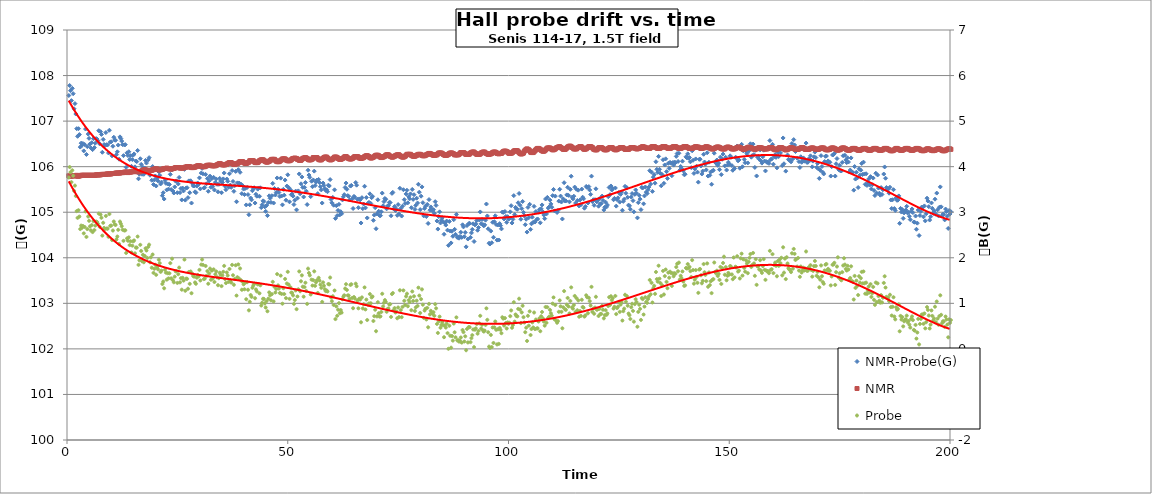
| Category | NMR-Probe(G) |
|---|---|
| 0.4 | 107.562 |
| 0.6000000000000001 | 107.782 |
| 0.8 | 107.668 |
| 1.0 | 107.45 |
| 1.2 | 107.72 |
| 1.4 | 107.602 |
| 1.5999999999999999 | 107.27 |
| 1.7999999999999998 | 107.384 |
| 1.9999999999999998 | 107.156 |
| 2.1999999999999997 | 106.834 |
| 2.4 | 106.666 |
| 2.6 | 106.834 |
| 2.8000000000000003 | 106.704 |
| 3.0000000000000004 | 106.43 |
| 3.2000000000000006 | 106.516 |
| 3.400000000000001 | 106.47 |
| 3.600000000000001 | 106.508 |
| 3.800000000000001 | 106.346 |
| 4.000000000000001 | 106.486 |
| 4.200000000000001 | 106.826 |
| 4.400000000000001 | 106.268 |
| 4.600000000000001 | 106.44 |
| 4.800000000000002 | 106.716 |
| 5.000000000000002 | 106.622 |
| 5.200000000000002 | 106.498 |
| 5.400000000000002 | 106.412 |
| 5.600000000000002 | 106.526 |
| 5.8000000000000025 | 106.374 |
| 6.000000000000003 | 106.614 |
| 6.200000000000003 | 106.418 |
| 6.400000000000003 | 106.516 |
| 6.600000000000003 | 106.616 |
| 6.800000000000003 | 106.606 |
| 7.0000000000000036 | 106.568 |
| 7.200000000000004 | 106.79 |
| 7.400000000000004 | 106.5 |
| 7.600000000000004 | 106.768 |
| 7.800000000000004 | 106.708 |
| 8.000000000000004 | 106.316 |
| 8.200000000000003 | 106.598 |
| 8.400000000000002 | 106.486 |
| 8.600000000000001 | 106.464 |
| 8.8 | 106.748 |
| 9.0 | 106.482 |
| 9.2 | 106.478 |
| 9.399999999999999 | 106.3 |
| 9.599999999999998 | 106.8 |
| 9.799999999999997 | 106.54 |
| 9.999999999999996 | 106.546 |
| 10.199999999999996 | 106.238 |
| 10.399999999999995 | 106.448 |
| 10.599999999999994 | 106.646 |
| 10.799999999999994 | 106.584 |
| 10.999999999999993 | 106.58 |
| 11.199999999999992 | 106.262 |
| 11.399999999999991 | 106.326 |
| 11.59999999999999 | 106.474 |
| 11.79999999999999 | 106.164 |
| 11.99999999999999 | 106.654 |
| 12.199999999999989 | 106.618 |
| 12.399999999999988 | 106.562 |
| 12.599999999999987 | 106.484 |
| 12.799999999999986 | 106.242 |
| 12.999999999999986 | 106.478 |
| 13.199999999999985 | 106.484 |
| 13.399999999999984 | 105.986 |
| 13.599999999999984 | 106.304 |
| 13.799999999999983 | 106.244 |
| 13.999999999999982 | 106.328 |
| 14.199999999999982 | 106.158 |
| 14.39999999999998 | 106.242 |
| 14.59999999999998 | 106.008 |
| 14.79999999999998 | 106.156 |
| 14.999999999999979 | 106.252 |
| 15.199999999999978 | 106.28 |
| 15.399999999999977 | 105.996 |
| 15.599999999999977 | 106.124 |
| 15.799999999999976 | 106.112 |
| 15.999999999999975 | 106.356 |
| 16.199999999999974 | 105.734 |
| 16.399999999999974 | 105.834 |
| 16.599999999999973 | 106.174 |
| 16.799999999999972 | 106.05 |
| 16.99999999999997 | 105.834 |
| 17.19999999999997 | 105.986 |
| 17.39999999999997 | 105.832 |
| 17.59999999999997 | 105.97 |
| 17.79999999999997 | 106.138 |
| 17.999999999999968 | 106.08 |
| 18.199999999999967 | 105.916 |
| 18.399999999999967 | 106.148 |
| 18.599999999999966 | 106.198 |
| 18.799999999999965 | 105.812 |
| 18.999999999999964 | 105.93 |
| 19.199999999999964 | 105.702 |
| 19.399999999999963 | 106.002 |
| 19.599999999999962 | 105.608 |
| 19.79999999999996 | 105.708 |
| 19.99999999999996 | 105.796 |
| 20.19999999999996 | 105.576 |
| 20.39999999999996 | 105.746 |
| 20.59999999999996 | 105.688 |
| 20.799999999999958 | 105.888 |
| 20.999999999999957 | 105.812 |
| 21.199999999999957 | 105.62 |
| 21.399999999999956 | 105.658 |
| 21.599999999999955 | 105.364 |
| 21.799999999999955 | 105.428 |
| 21.999999999999954 | 105.29 |
| 22.199999999999953 | 105.698 |
| 22.399999999999952 | 105.634 |
| 22.59999999999995 | 105.49 |
| 22.79999999999995 | 105.622 |
| 22.99999999999995 | 105.508 |
| 23.19999999999995 | 105.61 |
| 23.39999999999995 | 105.832 |
| 23.599999999999948 | 105.498 |
| 23.799999999999947 | 105.93 |
| 23.999999999999947 | 105.466 |
| 24.199999999999946 | 105.422 |
| 24.399999999999945 | 105.556 |
| 24.599999999999945 | 105.682 |
| 24.799999999999944 | 105.688 |
| 24.999999999999943 | 105.428 |
| 25.199999999999942 | 105.62 |
| 25.39999999999994 | 105.764 |
| 25.59999999999994 | 105.43 |
| 25.79999999999994 | 105.522 |
| 25.99999999999994 | 105.27 |
| 26.19999999999994 | 105.53 |
| 26.399999999999938 | 105.468 |
| 26.599999999999937 | 105.94 |
| 26.799999999999937 | 105.266 |
| 26.999999999999936 | 105.532 |
| 27.199999999999935 | 105.538 |
| 27.399999999999935 | 105.32 |
| 27.599999999999934 | 105.688 |
| 27.799999999999933 | 105.428 |
| 27.999999999999932 | 105.69 |
| 28.199999999999932 | 105.202 |
| 28.39999999999993 | 105.63 |
| 28.59999999999993 | 105.578 |
| 28.79999999999993 | 105.576 |
| 28.99999999999993 | 105.448 |
| 29.19999999999993 | 105.43 |
| 29.399999999999928 | 105.574 |
| 29.599999999999927 | 105.642 |
| 29.799999999999926 | 105.612 |
| 29.999999999999925 | 105.754 |
| 30.199999999999925 | 105.512 |
| 30.399999999999924 | 105.86 |
| 30.599999999999923 | 105.962 |
| 30.799999999999923 | 105.844 |
| 30.999999999999922 | 105.532 |
| 31.19999999999992 | 105.542 |
| 31.39999999999992 | 105.83 |
| 31.59999999999992 | 105.624 |
| 31.79999999999992 | 105.738 |
| 31.99999999999992 | 105.46 |
| 32.19999999999992 | 105.686 |
| 32.39999999999992 | 105.792 |
| 32.59999999999992 | 105.548 |
| 32.799999999999926 | 105.738 |
| 32.99999999999993 | 105.562 |
| 33.19999999999993 | 105.766 |
| 33.399999999999935 | 105.488 |
| 33.59999999999994 | 105.658 |
| 33.79999999999994 | 105.73 |
| 33.99999999999994 | 105.612 |
| 34.199999999999946 | 105.448 |
| 34.39999999999995 | 105.612 |
| 34.59999999999995 | 105.742 |
| 34.799999999999955 | 105.686 |
| 34.99999999999996 | 105.428 |
| 35.19999999999996 | 105.654 |
| 35.39999999999996 | 105.732 |
| 35.599999999999966 | 105.862 |
| 35.79999999999997 | 105.57 |
| 35.99999999999997 | 105.494 |
| 36.199999999999974 | 105.728 |
| 36.39999999999998 | 105.68 |
| 36.59999999999998 | 105.55 |
| 36.79999999999998 | 105.844 |
| 36.999999999999986 | 105.596 |
| 37.19999999999999 | 105.546 |
| 37.39999999999999 | 105.914 |
| 37.599999999999994 | 105.676 |
| 37.8 | 105.458 |
| 38.0 | 105.584 |
| 38.2 | 105.896 |
| 38.400000000000006 | 105.23 |
| 38.60000000000001 | 105.644 |
| 38.80000000000001 | 105.934 |
| 39.000000000000014 | 105.64 |
| 39.20000000000002 | 105.876 |
| 39.40000000000002 | 105.616 |
| 39.60000000000002 | 105.408 |
| 39.800000000000026 | 105.582 |
| 40.00000000000003 | 105.508 |
| 40.20000000000003 | 105.388 |
| 40.400000000000034 | 105.524 |
| 40.60000000000004 | 105.16 |
| 40.80000000000004 | 105.544 |
| 41.00000000000004 | 105.388 |
| 41.200000000000045 | 104.946 |
| 41.40000000000005 | 105.164 |
| 41.60000000000005 | 105.312 |
| 41.800000000000054 | 105.272 |
| 42.00000000000006 | 105.472 |
| 42.20000000000006 | 105.522 |
| 42.40000000000006 | 105.538 |
| 42.600000000000065 | 105.202 |
| 42.80000000000007 | 105.394 |
| 43.00000000000007 | 105.352 |
| 43.200000000000074 | 105.506 |
| 43.40000000000008 | 105.532 |
| 43.60000000000008 | 105.35 |
| 43.80000000000008 | 105.536 |
| 44.000000000000085 | 105.102 |
| 44.20000000000009 | 105.164 |
| 44.40000000000009 | 105.25 |
| 44.600000000000094 | 105.236 |
| 44.8000000000001 | 105.118 |
| 45.0000000000001 | 105.018 |
| 45.2000000000001 | 105.148 |
| 45.400000000000105 | 104.926 |
| 45.60000000000011 | 105.212 |
| 45.80000000000011 | 105.36 |
| 46.000000000000114 | 105.306 |
| 46.20000000000012 | 105.216 |
| 46.40000000000012 | 105.362 |
| 46.60000000000012 | 105.632 |
| 46.800000000000125 | 105.202 |
| 47.00000000000013 | 105.522 |
| 47.20000000000013 | 105.378 |
| 47.400000000000134 | 105.434 |
| 47.600000000000136 | 105.752 |
| 47.80000000000014 | 105.504 |
| 48.00000000000014 | 105.434 |
| 48.200000000000145 | 105.346 |
| 48.40000000000015 | 105.748 |
| 48.60000000000015 | 105.356 |
| 48.80000000000015 | 105.162 |
| 49.000000000000156 | 105.502 |
| 49.20000000000016 | 105.374 |
| 49.40000000000016 | 105.706 |
| 49.600000000000165 | 105.264 |
| 49.80000000000017 | 105.574 |
| 50.00000000000017 | 105.822 |
| 50.20000000000017 | 105.542 |
| 50.400000000000176 | 105.228 |
| 50.60000000000018 | 105.494 |
| 50.80000000000018 | 105.386 |
| 51.000000000000185 | 105.4 |
| 51.20000000000019 | 105.354 |
| 51.40000000000019 | 105.168 |
| 51.60000000000019 | 105.262 |
| 51.800000000000196 | 105.464 |
| 52.0000000000002 | 105.052 |
| 52.2000000000002 | 105.31 |
| 52.400000000000205 | 105.468 |
| 52.60000000000021 | 105.84 |
| 52.80000000000021 | 105.406 |
| 53.00000000000021 | 105.624 |
| 53.200000000000216 | 105.774 |
| 53.40000000000022 | 105.546 |
| 53.60000000000022 | 105.336 |
| 53.800000000000225 | 105.546 |
| 54.00000000000023 | 105.652 |
| 54.20000000000023 | 105.462 |
| 54.40000000000023 | 105.168 |
| 54.600000000000236 | 105.922 |
| 54.80000000000024 | 105.816 |
| 55.00000000000024 | 105.764 |
| 55.200000000000244 | 105.344 |
| 55.40000000000025 | 105.68 |
| 55.60000000000025 | 105.56 |
| 55.80000000000025 | 105.708 |
| 56.000000000000256 | 105.902 |
| 56.20000000000026 | 105.584 |
| 56.40000000000026 | 105.66 |
| 56.600000000000264 | 105.706 |
| 56.80000000000027 | 105.408 |
| 57.00000000000027 | 105.72 |
| 57.20000000000027 | 105.648 |
| 57.400000000000276 | 105.56 |
| 57.60000000000028 | 105.49 |
| 57.80000000000028 | 105.202 |
| 58.000000000000284 | 105.64 |
| 58.20000000000029 | 105.586 |
| 58.40000000000029 | 105.518 |
| 58.60000000000029 | 105.478 |
| 58.800000000000296 | 105.492 |
| 59.0000000000003 | 105.45 |
| 59.2000000000003 | 105.594 |
| 59.400000000000304 | 105.576 |
| 59.60000000000031 | 105.716 |
| 59.80000000000031 | 105.28 |
| 60.00000000000031 | 105.206 |
| 60.200000000000315 | 105.326 |
| 60.40000000000032 | 105.154 |
| 60.60000000000032 | 105.492 |
| 60.800000000000324 | 104.864 |
| 61.00000000000033 | 105.144 |
| 61.20000000000033 | 104.926 |
| 61.40000000000033 | 105.04 |
| 61.600000000000335 | 105.174 |
| 61.80000000000034 | 104.942 |
| 62.00000000000034 | 105.012 |
| 62.200000000000344 | 104.966 |
| 62.40000000000035 | 105.27 |
| 62.60000000000035 | 105.338 |
| 62.80000000000035 | 105.386 |
| 63.000000000000355 | 105.544 |
| 63.20000000000036 | 105.64 |
| 63.40000000000036 | 105.504 |
| 63.600000000000364 | 105.364 |
| 63.80000000000037 | 105.35 |
| 64.00000000000037 | 105.268 |
| 64.20000000000037 | 105.574 |
| 64.40000000000038 | 105.59 |
| 64.60000000000038 | 105.298 |
| 64.80000000000038 | 105.082 |
| 65.00000000000038 | 105.348 |
| 65.20000000000039 | 105.326 |
| 65.40000000000039 | 105.652 |
| 65.60000000000039 | 105.594 |
| 65.8000000000004 | 105.284 |
| 66.0000000000004 | 105.1 |
| 66.2000000000004 | 105.292 |
| 66.4000000000004 | 105.272 |
| 66.6000000000004 | 104.764 |
| 66.80000000000041 | 105.32 |
| 67.00000000000041 | 105.078 |
| 67.20000000000041 | 105.18 |
| 67.40000000000042 | 105.57 |
| 67.60000000000042 | 105.096 |
| 67.80000000000042 | 105.322 |
| 68.00000000000043 | 104.874 |
| 68.20000000000043 | 105.198 |
| 68.40000000000043 | 105.216 |
| 68.60000000000043 | 105.404 |
| 68.80000000000044 | 105.192 |
| 69.00000000000044 | 105.32 |
| 69.20000000000044 | 105.35 |
| 69.40000000000045 | 104.822 |
| 69.60000000000045 | 104.938 |
| 69.80000000000045 | 105.1 |
| 70.00000000000045 | 104.638 |
| 70.20000000000046 | 104.964 |
| 70.40000000000046 | 105.274 |
| 70.60000000000046 | 105.022 |
| 70.80000000000047 | 104.928 |
| 71.00000000000047 | 104.924 |
| 71.20000000000047 | 105.01 |
| 71.40000000000047 | 105.42 |
| 71.60000000000048 | 105.142 |
| 71.80000000000048 | 105.234 |
| 72.00000000000048 | 105.302 |
| 72.20000000000049 | 105.284 |
| 72.40000000000049 | 105.074 |
| 72.60000000000049 | 105.134 |
| 72.8000000000005 | 105.148 |
| 73.0000000000005 | 105.214 |
| 73.2000000000005 | 105.212 |
| 73.4000000000005 | 104.922 |
| 73.6000000000005 | 105.414 |
| 73.80000000000051 | 105.436 |
| 74.00000000000051 | 105.072 |
| 74.20000000000051 | 105.126 |
| 74.40000000000052 | 105.038 |
| 74.60000000000052 | 105.072 |
| 74.80000000000052 | 104.932 |
| 75.00000000000053 | 105.168 |
| 75.20000000000053 | 104.958 |
| 75.40000000000053 | 105.526 |
| 75.60000000000053 | 105.082 |
| 75.80000000000054 | 104.916 |
| 76.00000000000054 | 105.132 |
| 76.20000000000054 | 105.494 |
| 76.40000000000055 | 105.276 |
| 76.60000000000055 | 105.192 |
| 76.80000000000055 | 105.402 |
| 77.00000000000055 | 105.482 |
| 77.20000000000056 | 105.206 |
| 77.40000000000056 | 105.34 |
| 77.60000000000056 | 105.294 |
| 77.80000000000057 | 105.402 |
| 78.00000000000057 | 105.1 |
| 78.20000000000057 | 105.5 |
| 78.40000000000057 | 105.282 |
| 78.60000000000058 | 105.384 |
| 78.80000000000058 | 105.062 |
| 79.00000000000058 | 105.15 |
| 79.20000000000059 | 105.308 |
| 79.40000000000059 | 105.202 |
| 79.60000000000059 | 105.614 |
| 79.8000000000006 | 105.44 |
| 80.0000000000006 | 105.058 |
| 80.2000000000006 | 105.352 |
| 80.4000000000006 | 105.556 |
| 80.6000000000006 | 105.21 |
| 80.80000000000061 | 104.92 |
| 81.00000000000061 | 105.082 |
| 81.20000000000061 | 105.132 |
| 81.40000000000062 | 104.906 |
| 81.60000000000062 | 105.17 |
| 81.80000000000062 | 104.754 |
| 82.00000000000063 | 105.278 |
| 82.20000000000063 | 105.046 |
| 82.40000000000063 | 105.116 |
| 82.60000000000063 | 105.062 |
| 82.80000000000064 | 105.03 |
| 83.00000000000064 | 105.056 |
| 83.20000000000064 | 104.976 |
| 83.40000000000065 | 105.232 |
| 83.60000000000065 | 105.15 |
| 83.80000000000065 | 104.808 |
| 84.00000000000065 | 104.63 |
| 84.20000000000066 | 104.904 |
| 84.40000000000066 | 105.008 |
| 84.60000000000066 | 104.764 |
| 84.80000000000067 | 104.826 |
| 85.00000000000067 | 104.878 |
| 85.20000000000067 | 104.792 |
| 85.40000000000067 | 104.516 |
| 85.60000000000068 | 104.762 |
| 85.80000000000068 | 104.718 |
| 86.00000000000068 | 104.806 |
| 86.20000000000068 | 104.606 |
| 86.40000000000069 | 104.272 |
| 86.60000000000069 | 104.798 |
| 86.8000000000007 | 104.588 |
| 87.0000000000007 | 104.326 |
| 87.2000000000007 | 104.582 |
| 87.4000000000007 | 104.472 |
| 87.6000000000007 | 104.836 |
| 87.80000000000071 | 104.624 |
| 88.00000000000071 | 104.514 |
| 88.20000000000071 | 104.952 |
| 88.40000000000072 | 104.446 |
| 88.60000000000072 | 104.452 |
| 88.80000000000072 | 104.43 |
| 89.00000000000072 | 104.466 |
| 89.20000000000073 | 104.56 |
| 89.40000000000073 | 104.448 |
| 89.60000000000073 | 104.724 |
| 89.80000000000074 | 104.678 |
| 90.00000000000074 | 104.462 |
| 90.20000000000074 | 104.556 |
| 90.40000000000074 | 104.24 |
| 90.60000000000075 | 104.708 |
| 90.80000000000075 | 104.412 |
| 91.00000000000075 | 104.75 |
| 91.20000000000076 | 104.756 |
| 91.40000000000076 | 104.448 |
| 91.60000000000076 | 104.546 |
| 91.80000000000076 | 104.622 |
| 92.00000000000077 | 104.746 |
| 92.20000000000077 | 104.358 |
| 92.40000000000077 | 104.722 |
| 92.60000000000078 | 104.74 |
| 92.80000000000078 | 104.816 |
| 93.00000000000078 | 104.604 |
| 93.20000000000078 | 104.664 |
| 93.40000000000079 | 104.83 |
| 93.60000000000079 | 105.006 |
| 93.8000000000008 | 104.746 |
| 94.0000000000008 | 104.84 |
| 94.2000000000008 | 104.73 |
| 94.4000000000008 | 104.7 |
| 94.6000000000008 | 104.722 |
| 94.80000000000081 | 104.826 |
| 95.00000000000081 | 105.18 |
| 95.20000000000081 | 104.918 |
| 95.40000000000082 | 104.636 |
| 95.60000000000082 | 104.32 |
| 95.80000000000082 | 104.302 |
| 96.00000000000082 | 104.586 |
| 96.20000000000083 | 104.33 |
| 96.40000000000083 | 104.78 |
| 96.60000000000083 | 104.45 |
| 96.80000000000084 | 104.792 |
| 97.00000000000084 | 104.922 |
| 97.20000000000084 | 104.73 |
| 97.40000000000084 | 104.388 |
| 97.60000000000085 | 104.72 |
| 97.80000000000085 | 104.39 |
| 98.00000000000085 | 104.75 |
| 98.20000000000086 | 104.706 |
| 98.40000000000086 | 104.634 |
| 98.60000000000086 | 105.004 |
| 98.80000000000086 | 104.996 |
| 99.00000000000087 | 104.852 |
| 99.20000000000087 | 105.016 |
| 99.40000000000087 | 104.908 |
| 99.60000000000088 | 104.778 |
| 99.80000000000088 | 104.902 |
| 100.00000000000088 | 104.85 |
| 100.20000000000088 | 104.864 |
| 100.40000000000089 | 105.008 |
| 100.60000000000089 | 105.144 |
| 100.80000000000089 | 104.764 |
| 101.0000000000009 | 104.844 |
| 101.2000000000009 | 105.364 |
| 101.4000000000009 | 104.948 |
| 101.6000000000009 | 105.106 |
| 101.8000000000009 | 105.072 |
| 102.00000000000091 | 105.064 |
| 102.20000000000091 | 105.208 |
| 102.40000000000092 | 105.412 |
| 102.60000000000092 | 105.154 |
| 102.80000000000092 | 104.846 |
| 103.00000000000092 | 105.08 |
| 103.20000000000093 | 105.236 |
| 103.40000000000093 | 104.996 |
| 103.60000000000093 | 104.918 |
| 103.80000000000094 | 104.726 |
| 104.00000000000094 | 104.846 |
| 104.20000000000094 | 104.564 |
| 104.40000000000094 | 105.106 |
| 104.60000000000095 | 104.88 |
| 104.80000000000095 | 105.174 |
| 105.00000000000095 | 104.624 |
| 105.20000000000095 | 104.746 |
| 105.40000000000096 | 104.892 |
| 105.60000000000096 | 104.78 |
| 105.80000000000096 | 105.128 |
| 106.00000000000097 | 104.784 |
| 106.20000000000097 | 105.014 |
| 106.40000000000097 | 104.838 |
| 106.60000000000097 | 104.852 |
| 106.80000000000098 | 105 |
| 107.00000000000098 | 105.06 |
| 107.20000000000098 | 104.768 |
| 107.40000000000099 | 105.076 |
| 107.60000000000099 | 105.16 |
| 107.80000000000099 | 105.008 |
| 108.000000000001 | 104.94 |
| 108.200000000001 | 104.86 |
| 108.400000000001 | 105.29 |
| 108.600000000001 | 104.962 |
| 108.800000000001 | 105.326 |
| 109.00000000000101 | 105.092 |
| 109.20000000000101 | 105.116 |
| 109.40000000000101 | 105.266 |
| 109.60000000000102 | 105.182 |
| 109.80000000000102 | 105.11 |
| 110.00000000000102 | 105.364 |
| 110.20000000000103 | 105.5 |
| 110.40000000000103 | 105.03 |
| 110.60000000000103 | 105.354 |
| 110.80000000000103 | 105.028 |
| 111.00000000000104 | 104.994 |
| 111.20000000000104 | 105.038 |
| 111.40000000000104 | 105.244 |
| 111.60000000000105 | 105.504 |
| 111.80000000000105 | 105.354 |
| 112.00000000000105 | 105.224 |
| 112.20000000000105 | 104.852 |
| 112.40000000000106 | 105.292 |
| 112.60000000000106 | 105.648 |
| 112.80000000000106 | 105.248 |
| 113.00000000000107 | 105.248 |
| 113.20000000000107 | 105.38 |
| 113.40000000000107 | 105.548 |
| 113.60000000000107 | 105.37 |
| 113.80000000000108 | 105.228 |
| 114.00000000000108 | 105.502 |
| 114.20000000000108 | 105.79 |
| 114.40000000000109 | 105.33 |
| 114.60000000000109 | 105.294 |
| 114.80000000000109 | 105.352 |
| 115.0000000000011 | 105.552 |
| 115.2000000000011 | 105.202 |
| 115.4000000000011 | 105.504 |
| 115.6000000000011 | 105.258 |
| 115.8000000000011 | 105.484 |
| 116.00000000000111 | 105.136 |
| 116.20000000000111 | 105.27 |
| 116.40000000000111 | 105.164 |
| 116.60000000000112 | 105.508 |
| 116.80000000000112 | 105.33 |
| 117.00000000000112 | 105.294 |
| 117.20000000000113 | 105.088 |
| 117.40000000000113 | 105.126 |
| 117.60000000000113 | 105.566 |
| 117.80000000000113 | 105.544 |
| 118.00000000000114 | 105.202 |
| 118.20000000000114 | 105.562 |
| 118.40000000000114 | 105.488 |
| 118.60000000000115 | 105.392 |
| 118.80000000000115 | 105.792 |
| 119.00000000000115 | 105.232 |
| 119.20000000000115 | 105.274 |
| 119.40000000000116 | 105.152 |
| 119.60000000000116 | 105.276 |
| 119.80000000000116 | 105.514 |
| 120.00000000000117 | 105.228 |
| 120.20000000000117 | 105.26 |
| 120.40000000000117 | 105.132 |
| 120.60000000000117 | 105.298 |
| 120.80000000000118 | 105.184 |
| 121.00000000000118 | 105.19 |
| 121.20000000000118 | 105.354 |
| 121.40000000000119 | 105.26 |
| 121.60000000000119 | 105.05 |
| 121.80000000000119 | 105.11 |
| 122.0000000000012 | 105.22 |
| 122.2000000000012 | 105.116 |
| 122.4000000000012 | 105.158 |
| 122.6000000000012 | 105.34 |
| 122.8000000000012 | 105.544 |
| 123.00000000000121 | 105.386 |
| 123.20000000000121 | 105.576 |
| 123.40000000000121 | 105.488 |
| 123.60000000000122 | 105.524 |
| 123.80000000000122 | 105.274 |
| 124.00000000000122 | 105.304 |
| 124.20000000000122 | 105.532 |
| 124.40000000000123 | 105.134 |
| 124.60000000000123 | 105.276 |
| 124.80000000000123 | 105.316 |
| 125.00000000000124 | 105.432 |
| 125.20000000000124 | 105.222 |
| 125.40000000000124 | 105.392 |
| 125.60000000000124 | 105.444 |
| 125.80000000000125 | 105.042 |
| 126.00000000000125 | 105.238 |
| 126.20000000000125 | 105.284 |
| 126.40000000000126 | 105.568 |
| 126.60000000000126 | 105.416 |
| 126.80000000000126 | 105.54 |
| 127.00000000000126 | 105.328 |
| 127.20000000000127 | 105.156 |
| 127.40000000000127 | 105.14 |
| 127.60000000000127 | 105.066 |
| 127.80000000000128 | 105.334 |
| 128.00000000000128 | 105.41 |
| 128.20000000000127 | 105.254 |
| 128.40000000000126 | 105.008 |
| 128.60000000000124 | 105.392 |
| 128.80000000000123 | 105.49 |
| 129.00000000000122 | 105.418 |
| 129.2000000000012 | 104.876 |
| 129.4000000000012 | 105.212 |
| 129.6000000000012 | 105.37 |
| 129.80000000000118 | 105.288 |
| 130.00000000000117 | 105.056 |
| 130.20000000000115 | 105.546 |
| 130.40000000000114 | 105.532 |
| 130.60000000000113 | 105.184 |
| 130.80000000000112 | 105.358 |
| 131.0000000000011 | 105.554 |
| 131.2000000000011 | 105.442 |
| 131.40000000000109 | 105.41 |
| 131.60000000000107 | 105.494 |
| 131.80000000000106 | 105.552 |
| 132.00000000000105 | 105.912 |
| 132.20000000000104 | 105.618 |
| 132.40000000000103 | 105.88 |
| 132.60000000000102 | 105.458 |
| 132.800000000001 | 105.77 |
| 133.000000000001 | 105.824 |
| 133.20000000000098 | 105.638 |
| 133.40000000000097 | 106.108 |
| 133.60000000000096 | 105.942 |
| 133.80000000000095 | 105.876 |
| 134.00000000000094 | 106.226 |
| 134.20000000000093 | 105.942 |
| 134.40000000000092 | 105.856 |
| 134.6000000000009 | 105.58 |
| 134.8000000000009 | 105.826 |
| 135.00000000000088 | 106.152 |
| 135.20000000000087 | 105.634 |
| 135.40000000000086 | 106.038 |
| 135.60000000000085 | 106.172 |
| 135.80000000000084 | 105.89 |
| 136.00000000000082 | 105.742 |
| 136.2000000000008 | 106.074 |
| 136.4000000000008 | 105.962 |
| 136.6000000000008 | 106.094 |
| 136.80000000000078 | 106.078 |
| 137.00000000000077 | 105.802 |
| 137.20000000000076 | 106.09 |
| 137.40000000000074 | 106.034 |
| 137.60000000000073 | 106.102 |
| 137.80000000000072 | 106.088 |
| 138.0000000000007 | 106.226 |
| 138.2000000000007 | 106.288 |
| 138.4000000000007 | 106.114 |
| 138.60000000000068 | 106.294 |
| 138.80000000000067 | 105.922 |
| 139.00000000000065 | 106.004 |
| 139.20000000000064 | 105.96 |
| 139.40000000000063 | 106.12 |
| 139.60000000000062 | 105.908 |
| 139.8000000000006 | 105.824 |
| 140.0000000000006 | 105.834 |
| 140.20000000000059 | 106.216 |
| 140.40000000000057 | 106.194 |
| 140.60000000000056 | 106.282 |
| 140.80000000000055 | 106.184 |
| 141.00000000000054 | 106.2 |
| 141.20000000000053 | 106.106 |
| 141.40000000000052 | 105.978 |
| 141.6000000000005 | 106.348 |
| 141.8000000000005 | 106.14 |
| 142.00000000000048 | 105.852 |
| 142.20000000000047 | 105.95 |
| 142.40000000000046 | 106.17 |
| 142.60000000000045 | 106.01 |
| 142.80000000000044 | 105.88 |
| 143.00000000000043 | 105.66 |
| 143.20000000000041 | 106.162 |
| 143.4000000000004 | 106.164 |
| 143.6000000000004 | 106.016 |
| 143.80000000000038 | 105.84 |
| 144.00000000000037 | 105.904 |
| 144.20000000000036 | 106.272 |
| 144.40000000000035 | 106.102 |
| 144.60000000000034 | 106.054 |
| 144.80000000000032 | 105.928 |
| 145.0000000000003 | 106.306 |
| 145.2000000000003 | 105.794 |
| 145.4000000000003 | 106.098 |
| 145.60000000000028 | 105.81 |
| 145.80000000000027 | 105.884 |
| 146.00000000000026 | 105.614 |
| 146.20000000000024 | 105.906 |
| 146.40000000000023 | 105.922 |
| 146.60000000000022 | 106.296 |
| 146.8000000000002 | 106.098 |
| 147.0000000000002 | 106.08 |
| 147.2000000000002 | 106.146 |
| 147.40000000000018 | 106.03 |
| 147.60000000000016 | 106.078 |
| 147.80000000000015 | 105.934 |
| 148.00000000000014 | 106.21 |
| 148.20000000000013 | 105.826 |
| 148.40000000000012 | 106.162 |
| 148.6000000000001 | 106.276 |
| 148.8000000000001 | 106.414 |
| 149.00000000000009 | 106.018 |
| 149.20000000000007 | 106.206 |
| 149.40000000000006 | 105.926 |
| 149.60000000000005 | 106.036 |
| 149.80000000000004 | 106.098 |
| 150.00000000000003 | 106.052 |
| 150.20000000000002 | 106.238 |
| 150.4 | 106.206 |
| 150.6 | 106.024 |
| 150.79999999999998 | 105.92 |
| 150.99999999999997 | 106.396 |
| 151.19999999999996 | 105.96 |
| 151.39999999999995 | 106.204 |
| 151.59999999999994 | 106.196 |
| 151.79999999999993 | 106.454 |
| 151.99999999999991 | 106.128 |
| 152.1999999999999 | 106.148 |
| 152.3999999999999 | 105.966 |
| 152.59999999999988 | 106.398 |
| 152.79999999999987 | 106.49 |
| 152.99999999999986 | 105.998 |
| 153.19999999999985 | 106.346 |
| 153.39999999999984 | 106.158 |
| 153.59999999999982 | 106.086 |
| 153.7999999999998 | 106.344 |
| 153.9999999999998 | 106.284 |
| 154.1999999999998 | 106.082 |
| 154.39999999999978 | 106.342 |
| 154.59999999999977 | 106.418 |
| 154.79999999999976 | 106.502 |
| 154.99999999999974 | 106.208 |
| 155.19999999999973 | 106.242 |
| 155.39999999999972 | 106.496 |
| 155.5999999999997 | 106.266 |
| 155.7999999999997 | 105.984 |
| 155.9999999999997 | 106.36 |
| 156.19999999999968 | 105.796 |
| 156.39999999999966 | 106.21 |
| 156.59999999999965 | 106.23 |
| 156.79999999999964 | 106.162 |
| 156.99999999999963 | 106.368 |
| 157.19999999999962 | 106.128 |
| 157.3999999999996 | 106.078 |
| 157.5999999999996 | 106.218 |
| 157.79999999999959 | 106.362 |
| 157.99999999999957 | 106.124 |
| 158.19999999999956 | 105.906 |
| 158.39999999999955 | 106.11 |
| 158.59999999999954 | 106.092 |
| 158.79999999999953 | 106.104 |
| 158.99999999999952 | 106.072 |
| 159.1999999999995 | 106.572 |
| 159.3999999999995 | 106.154 |
| 159.59999999999948 | 106.17 |
| 159.79999999999947 | 106.49 |
| 159.99999999999946 | 106.054 |
| 160.19999999999945 | 106.22 |
| 160.39999999999944 | 106.264 |
| 160.59999999999943 | 106.204 |
| 160.79999999999941 | 105.974 |
| 160.9999999999994 | 106.318 |
| 161.1999999999994 | 106.222 |
| 161.39999999999938 | 106.38 |
| 161.59999999999937 | 106.302 |
| 161.79999999999936 | 106.42 |
| 161.99999999999935 | 106.024 |
| 162.19999999999933 | 106.63 |
| 162.39999999999932 | 106.064 |
| 162.5999999999993 | 106.362 |
| 162.7999999999993 | 105.902 |
| 162.9999999999993 | 106.382 |
| 163.19999999999928 | 106.256 |
| 163.39999999999927 | 106.16 |
| 163.59999999999926 | 106.144 |
| 163.79999999999924 | 106.142 |
| 163.99999999999923 | 106.106 |
| 164.19999999999922 | 106.508 |
| 164.3999999999992 | 106.17 |
| 164.5999999999992 | 106.594 |
| 164.7999999999992 | 106.476 |
| 164.99999999999918 | 106.332 |
| 165.19999999999916 | 106.354 |
| 165.39999999999915 | 106.186 |
| 165.59999999999914 | 106.376 |
| 165.79999999999913 | 106.11 |
| 165.99999999999912 | 105.982 |
| 166.1999999999991 | 106.218 |
| 166.3999999999991 | 106.096 |
| 166.59999999999908 | 106.144 |
| 166.79999999999907 | 106.192 |
| 166.99999999999906 | 106.12 |
| 167.19999999999905 | 106.144 |
| 167.39999999999904 | 106.518 |
| 167.59999999999903 | 106.094 |
| 167.79999999999902 | 106.096 |
| 167.999999999999 | 106.172 |
| 168.199999999999 | 106.154 |
| 168.39999999999898 | 106.238 |
| 168.59999999999897 | 106.142 |
| 168.79999999999896 | 105.996 |
| 168.99999999999895 | 106.122 |
| 169.19999999999894 | 106.216 |
| 169.39999999999893 | 106.32 |
| 169.59999999999891 | 106.2 |
| 169.7999999999989 | 105.984 |
| 169.9999999999989 | 106.072 |
| 170.19999999999888 | 105.952 |
| 170.39999999999887 | 105.742 |
| 170.59999999999886 | 105.92 |
| 170.79999999999885 | 106.242 |
| 170.99999999999883 | 106.004 |
| 171.19999999999882 | 105.876 |
| 171.3999999999988 | 105.84 |
| 171.5999999999988 | 106.112 |
| 171.7999999999988 | 106.228 |
| 171.99999999999878 | 106.234 |
| 172.19999999999877 | 106.096 |
| 172.39999999999876 | 106.126 |
| 172.59999999999874 | 106.096 |
| 172.79999999999873 | 106.096 |
| 172.99999999999872 | 105.794 |
| 173.1999999999987 | 106 |
| 173.3999999999987 | 106.256 |
| 173.5999999999987 | 106.264 |
| 173.79999999999868 | 106.29 |
| 173.99999999999866 | 105.794 |
| 174.19999999999865 | 106.064 |
| 174.39999999999864 | 106.178 |
| 174.59999999999863 | 106.37 |
| 174.79999999999862 | 105.934 |
| 174.9999999999986 | 106.03 |
| 175.1999999999986 | 105.906 |
| 175.39999999999858 | 105.906 |
| 175.59999999999857 | 106.094 |
| 175.79999999999856 | 106.24 |
| 175.99999999999855 | 106.4 |
| 176.19999999999854 | 106.25 |
| 176.39999999999853 | 106.146 |
| 176.59999999999852 | 106.09 |
| 176.7999999999985 | 106.194 |
| 176.9999999999985 | 106.102 |
| 177.19999999999848 | 105.882 |
| 177.39999999999847 | 105.926 |
| 177.59999999999846 | 106.192 |
| 177.79999999999845 | 105.878 |
| 177.99999999999844 | 105.874 |
| 178.19999999999843 | 105.484 |
| 178.3999999999984 | 106.002 |
| 178.5999999999984 | 105.728 |
| 178.7999999999984 | 105.878 |
| 178.99999999999838 | 105.752 |
| 179.19999999999837 | 105.542 |
| 179.39999999999836 | 105.954 |
| 179.59999999999835 | 105.814 |
| 179.79999999999833 | 105.922 |
| 179.99999999999832 | 106.07 |
| 180.1999999999983 | 105.828 |
| 180.3999999999983 | 106.1 |
| 180.5999999999983 | 105.84 |
| 180.79999999999828 | 105.612 |
| 180.99999999999827 | 105.844 |
| 181.19999999999825 | 105.588 |
| 181.39999999999824 | 105.648 |
| 181.59999999999823 | 105.73 |
| 181.79999999999822 | 105.596 |
| 181.9999999999982 | 105.782 |
| 182.1999999999982 | 105.51 |
| 182.3999999999982 | 105.602 |
| 182.59999999999818 | 105.75 |
| 182.79999999999816 | 105.476 |
| 182.99999999999815 | 105.366 |
| 183.19999999999814 | 105.856 |
| 183.39999999999813 | 105.418 |
| 183.59999999999812 | 105.818 |
| 183.7999999999981 | 105.53 |
| 183.9999999999981 | 105.418 |
| 184.19999999999808 | 105.374 |
| 184.39999999999807 | 105.54 |
| 184.59999999999806 | 105.39 |
| 184.79999999999805 | 105.494 |
| 184.99999999999804 | 105.838 |
| 185.19999999999803 | 105.994 |
| 185.39999999999802 | 105.746 |
| 185.599999999998 | 105.542 |
| 185.799999999998 | 105.504 |
| 185.99999999999798 | 105.506 |
| 186.19999999999797 | 105.418 |
| 186.39999999999796 | 105.548 |
| 186.59999999999795 | 105.268 |
| 186.79999999999794 | 105.082 |
| 186.99999999999793 | 105.274 |
| 187.1999999999979 | 105.494 |
| 187.3999999999979 | 105.08 |
| 187.5999999999979 | 105.038 |
| 187.79999999999788 | 105.312 |
| 187.99999999999787 | 105.262 |
| 188.19999999999786 | 105.266 |
| 188.39999999999785 | 105.358 |
| 188.59999999999783 | 104.756 |
| 188.79999999999782 | 105.084 |
| 188.9999999999978 | 105.004 |
| 189.1999999999978 | 105.058 |
| 189.3999999999978 | 104.864 |
| 189.59999999999778 | 104.986 |
| 189.79999999999777 | 105.026 |
| 189.99999999999775 | 105.05 |
| 190.19999999999774 | 105.13 |
| 190.39999999999773 | 104.984 |
| 190.59999999999772 | 105.002 |
| 190.7999999999977 | 104.912 |
| 190.9999999999977 | 104.838 |
| 191.1999999999977 | 105.018 |
| 191.39999999999768 | 105.072 |
| 191.59999999999766 | 104.992 |
| 191.79999999999765 | 104.786 |
| 191.99999999999764 | 104.78 |
| 192.19999999999763 | 104.916 |
| 192.39999999999762 | 104.626 |
| 192.5999999999976 | 104.76 |
| 192.7999999999976 | 105.048 |
| 192.99999999999758 | 104.488 |
| 193.19999999999757 | 104.928 |
| 193.39999999999756 | 105.018 |
| 193.59999999999755 | 105.114 |
| 193.79999999999754 | 105.104 |
| 193.99999999999753 | 104.9 |
| 194.19999999999752 | 105.138 |
| 194.3999999999975 | 104.81 |
| 194.5999999999975 | 104.966 |
| 194.79999999999748 | 105.308 |
| 194.99999999999747 | 105.246 |
| 195.19999999999746 | 105.122 |
| 195.39999999999745 | 104.828 |
| 195.59999999999744 | 104.902 |
| 195.79999999999742 | 105.204 |
| 195.9999999999974 | 105.084 |
| 196.1999999999974 | 104.974 |
| 196.3999999999974 | 105.026 |
| 196.59999999999738 | 105.286 |
| 196.79999999999737 | 104.956 |
| 196.99999999999736 | 105.42 |
| 197.19999999999735 | 105.054 |
| 197.39999999999733 | 104.92 |
| 197.59999999999732 | 105.11 |
| 197.7999999999973 | 105.556 |
| 197.9999999999973 | 105.118 |
| 198.1999999999973 | 104.922 |
| 198.39999999999728 | 104.956 |
| 198.59999999999727 | 104.952 |
| 198.79999999999725 | 104.832 |
| 198.99999999999724 | 105.07 |
| 199.19999999999723 | 105.016 |
| 199.39999999999722 | 104.914 |
| 199.5999999999972 | 104.644 |
| 199.7999999999972 | 105.038 |
| 199.9999999999972 | 104.962 |
| 200.19999999999717 | 105.012 |